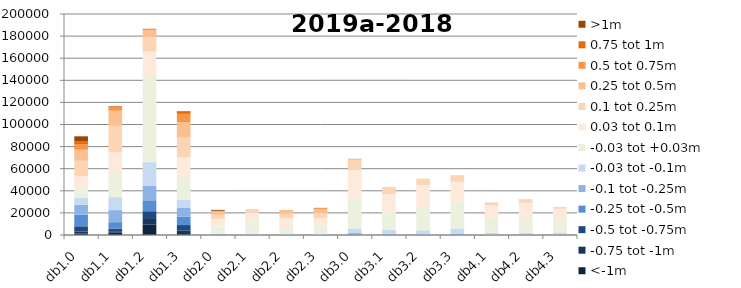
| Category | <-1m | -0.75 tot -1m | -0.5 tot -0.75m | -0.25 tot -0.5m | -0.1 tot -0.25m | -0.03 tot -0.1m | -0.03 tot +0.03m | 0.03 tot 0.1m | 0.1 tot 0.25m | 0.25 tot 0.5m | 0.5 tot 0.75m | 0.75 tot 1m | >1m |
|---|---|---|---|---|---|---|---|---|---|---|---|---|---|
| db1.0 | 1456 | 1785 | 4644 | 10555 | 8984 | 6345 | 8639 | 10787 | 13931 | 10059 | 5088 | 2713 | 4315 |
| db1.1 | 2380 | 1027 | 2324 | 5890 | 10910 | 11675 | 23917 | 16564 | 24095 | 13704 | 3521 | 561 | 127 |
| db1.2 | 9595 | 5699 | 6226 | 9871 | 13021 | 21533 | 77862 | 22170 | 12885 | 6654 | 1053 | 119 | 11 |
| db1.3 | 808 | 3356 | 4835 | 7742 | 7908 | 7240 | 20917 | 17522 | 17776 | 14094 | 7410 | 1960 | 497 |
| db2.0 | 60 | 40 | 53 | 74 | 276 | 421 | 6771 | 6906 | 3716 | 2785 | 681 | 159 | 820 |
| db2.1 | 43 | 14 | 17 | 42 | 66 | 1065 | 12724 | 6380 | 2556 | 395 | 38 | 1 | 0 |
| db2.2 | 40 | 11 | 14 | 20 | 52 | 385 | 6689 | 7786 | 4404 | 2578 | 451 | 43 | 1 |
| db2.3 | 0 | 0 | 1 | 11 | 52 | 606 | 7774 | 6474 | 5257 | 3324 | 856 | 138 | 58 |
| db3.0 | 83 | 17 | 70 | 234 | 1328 | 4162 | 27725 | 25055 | 9184 | 848 | 83 | 35 | 74 |
| db3.1 | 0 | 2 | 14 | 157 | 1042 | 3423 | 16521 | 15907 | 5875 | 472 | 10 | 2 | 0 |
| db3.2 | 0 | 0 | 2 | 27 | 654 | 3601 | 20167 | 20850 | 5247 | 359 | 23 | 7 | 7 |
| db3.3 | 0 | 1 | 7 | 51 | 810 | 5003 | 24534 | 17736 | 5279 | 475 | 18 | 4 | 2 |
| db4.1 | 0 | 1 | 0 | 14 | 245 | 1677 | 13986 | 10838 | 2499 | 238 | 8 | 2 | 0 |
| db4.2 | 0 | 0 | 3 | 43 | 411 | 1573 | 14071 | 12960 | 3099 | 333 | 10 | 1 | 0 |
| db4.3 | 0 | 1 | 4 | 72 | 470 | 1269 | 12353 | 9604 | 1389 | 131 | 10 | 3 | 0 |